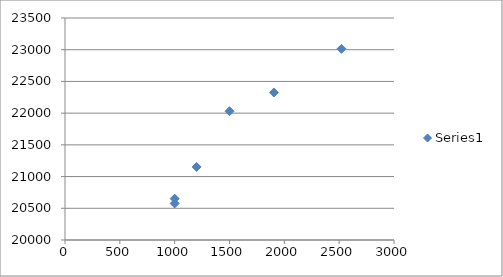
| Category | Series 0 |
|---|---|
| 1000.0 | 20652 |
| 1000.0 | 20576 |
| 1200.0 | 21152 |
| 1500.0 | 22030 |
| 1905.0 | 22325 |
| 2521.0 | 23014 |